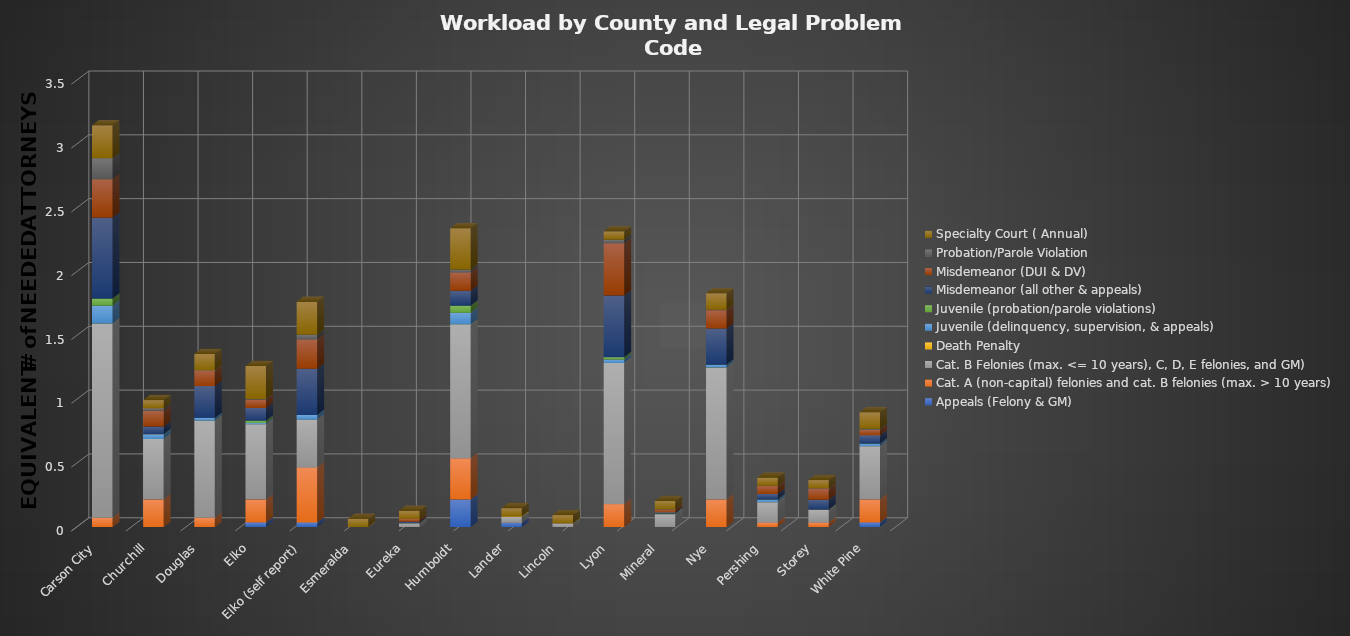
| Category | Appeals (Felony & GM) | Cat. A (non-capital) felonies and cat. B felonies (max. > 10 years) | Cat. B Felonies (max. <= 10 years), C, D, E felonies, and GM) | Death Penalty | Juvenile (delinquency, supervision, & appeals) | Juvenile (probation/parole violations) | Misdemeanor (all other & appeals) | Misdemeanor (DUI & DV) | Probation/Parole Violation | Specialty Court ( Annual) |
|---|---|---|---|---|---|---|---|---|---|---|
| Carson City | 0 | 0.072 | 1.522 | 0 | 0.14 | 0.056 | 0.633 | 0.302 | 0.164 | 0.259 |
| Churchill | 0 | 0.215 | 0.474 | 0 | 0.038 | 0 | 0.06 | 0.122 | 0.02 | 0.065 |
| Douglas | 0 | 0.072 | 0.761 | 0 | 0.022 | 0 | 0.25 | 0.122 | 0 | 0.129 |
| Elko | 0.036 | 0.18 | 0.589 | 0 | 0.011 | 0.019 | 0.099 | 0.065 | 0.006 | 0.259 |
| Elko (self report) | 0.036 | 0.431 | 0.373 | 0 | 0.038 | 0 | 0.362 | 0.23 | 0.037 | 0.259 |
| Esmeralda | 0 | 0 | 0 | 0 | 0 | 0 | 0 | 0 | 0 | 0.065 |
| Eureka | 0 | 0 | 0.029 | 0 | 0 | 0 | 0.013 | 0.022 | 0 | 0.065 |
| Humboldt | 0.215 | 0.323 | 1.048 | 0 | 0.092 | 0.056 | 0.116 | 0.144 | 0.023 | 0.323 |
| Lander | 0.036 | 0 | 0.043 | 0 | 0 | 0 | 0.004 | 0 | 0 | 0.065 |
| Lincoln | 0 | 0 | 0.029 | 0 | 0 | 0 | 0 | 0 | 0 | 0.065 |
| Lyon | 0 | 0.18 | 1.106 | 0 | 0.027 | 0.019 | 0.483 | 0.409 | 0.029 | 0.065 |
| Mineral | 0 | 0 | 0.101 | 0 | 0.005 | 0 | 0.009 | 0.022 | 0.003 | 0.065 |
| Nye | 0 | 0.215 | 1.034 | 0 | 0.022 | 0 | 0.284 | 0.144 | 0.003 | 0.129 |
| Pershing | 0 | 0.036 | 0.158 | 0 | 0.022 | 0 | 0.043 | 0.065 | 0 | 0.065 |
| Storey | 0 | 0.036 | 0.101 | 0 | 0 | 0 | 0.078 | 0.086 | 0.003 | 0.065 |
| White Pine | 0.036 | 0.18 | 0.416 | 0 | 0.022 | 0 | 0.065 | 0.043 | 0.009 | 0.129 |